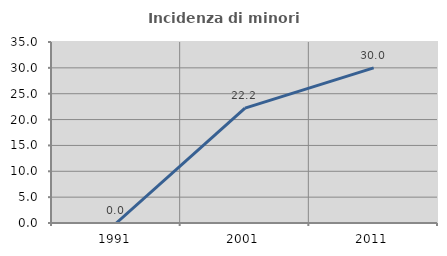
| Category | Incidenza di minori stranieri |
|---|---|
| 1991.0 | 0 |
| 2001.0 | 22.222 |
| 2011.0 | 30 |